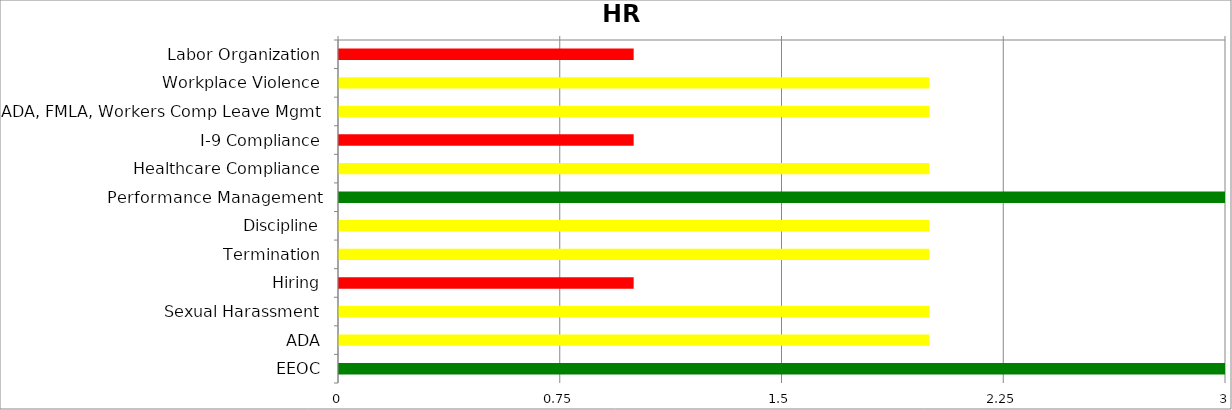
| Category | Low | Medium | High |
|---|---|---|---|
| Labor Organization | 0 | 0 | 1 |
| Workplace Violence | 0 | 2 | 0 |
| ADA, FMLA, Workers Comp Leave Mgmt | 0 | 2 | 0 |
| I-9 Compliance | 0 | 0 | 1 |
| Healthcare Compliance | 0 | 2 | 0 |
| Performance Management | 3 | 0 | 0 |
| Discipline | 0 | 2 | 0 |
| Termination | 0 | 2 | 0 |
| Hiring | 0 | 0 | 1 |
| Sexual Harassment | 0 | 2 | 0 |
| ADA | 0 | 2 | 0 |
| EEOC | 3 | 0 | 0 |